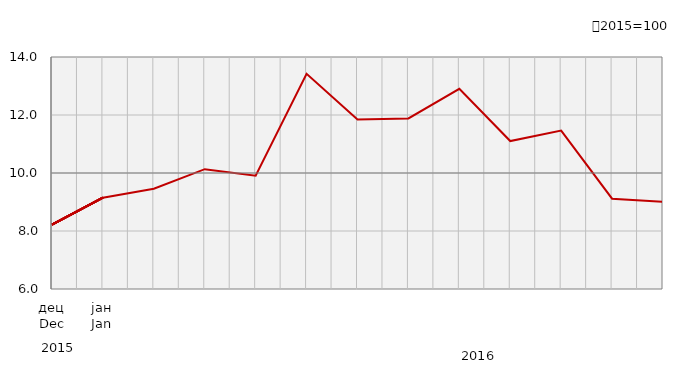
| Category | Индекси ноћења туриста
Tourist night indices |
|---|---|
| дец
Dec | 82.203 |
| јан
Jan | 91.47 |